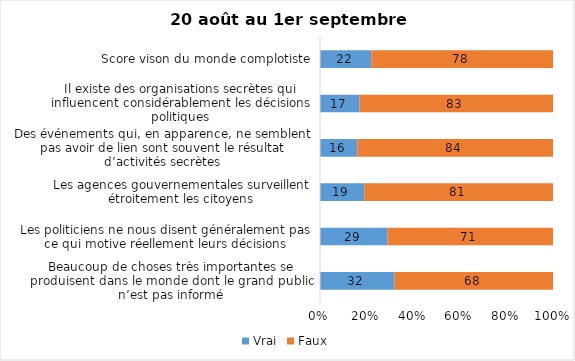
| Category | Vrai | Faux |
|---|---|---|
| Beaucoup de choses très importantes se produisent dans le monde dont le grand public n’est pas informé | 32 | 68 |
| Les politiciens ne nous disent généralement pas ce qui motive réellement leurs décisions | 29 | 71 |
| Les agences gouvernementales surveillent étroitement les citoyens | 19 | 81 |
| Des événements qui, en apparence, ne semblent pas avoir de lien sont souvent le résultat d’activités secrètes | 16 | 84 |
| Il existe des organisations secrètes qui influencent considérablement les décisions politiques | 17 | 83 |
| Score vison du monde complotiste | 22 | 78 |